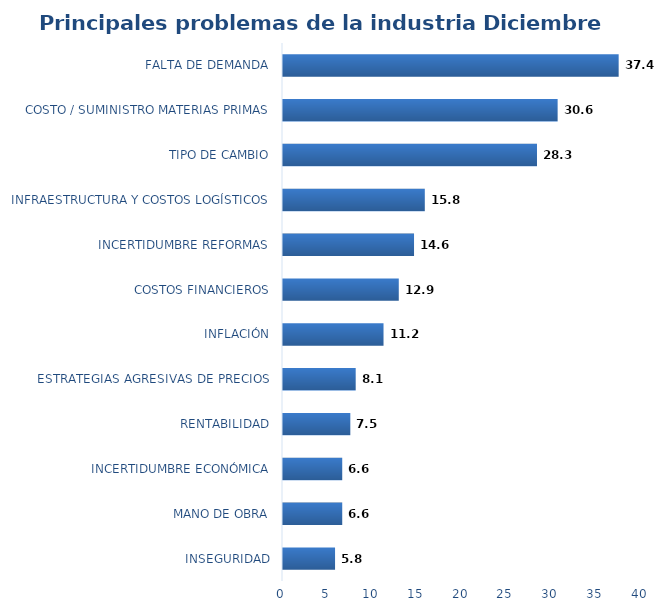
| Category | Series 0 |
|---|---|
| INSEGURIDAD | 5.8 |
| MANO DE OBRA | 6.6 |
| INCERTIDUMBRE ECONÓMICA | 6.6 |
| RENTABILIDAD | 7.5 |
| ESTRATEGIAS AGRESIVAS DE PRECIOS | 8.1 |
| INFLACIÓN | 11.2 |
| COSTOS FINANCIEROS | 12.9 |
| INCERTIDUMBRE REFORMAS | 14.6 |
| INFRAESTRUCTURA Y COSTOS LOGÍSTICOS | 15.8 |
| TIPO DE CAMBIO | 28.3 |
| COSTO / SUMINISTRO MATERIAS PRIMAS | 30.6 |
| FALTA DE DEMANDA | 37.4 |